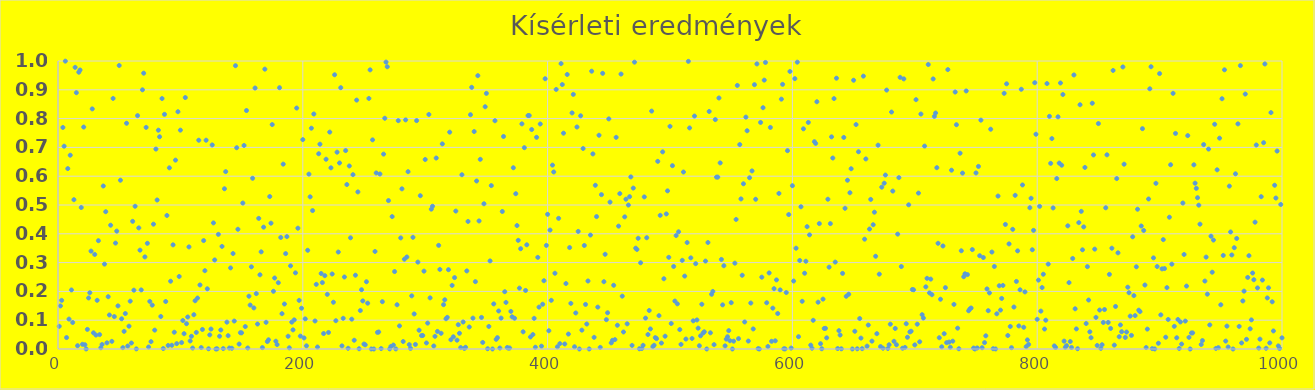
| Category | Series 0 |
|---|---|
| 1.0 | 0.079 |
| 2.0 | 0.15 |
| 3.0 | 0.169 |
| 4.0 | 0.769 |
| 5.0 | 0.704 |
| 6.0 | 0.999 |
| 7.0 | 0.04 |
| 8.0 | 0.626 |
| 9.0 | 0.104 |
| 10.0 | 0.673 |
| 11.0 | 0.205 |
| 12.0 | 0.092 |
| 13.0 | 0.518 |
| 14.0 | 0.978 |
| 15.0 | 0.89 |
| 16.0 | 0.011 |
| 17.0 | 0.961 |
| 18.0 | 0.969 |
| 19.0 | 0.491 |
| 20.0 | 0.016 |
| 21.0 | 0.771 |
| 22.0 | 0.015 |
| 23.0 | 0 |
| 24.0 | 0.068 |
| 25.0 | 0.177 |
| 26.0 | 0.195 |
| 27.0 | 0.34 |
| 28.0 | 0.834 |
| 29.0 | 0.056 |
| 30.0 | 0.328 |
| 31.0 | 0.048 |
| 32.0 | 0.169 |
| 33.0 | 0.376 |
| 34.0 | 0.05 |
| 35.0 | 0.004 |
| 36.0 | 0.016 |
| 37.0 | 0.566 |
| 38.0 | 0.295 |
| 39.0 | 0.477 |
| 40.0 | 0.021 |
| 41.0 | 0.182 |
| 42.0 | 0.118 |
| 43.0 | 0.43 |
| 44.0 | 0.027 |
| 45.0 | 0.87 |
| 46.0 | 0.113 |
| 47.0 | 0.368 |
| 48.0 | 0.409 |
| 49.0 | 0.15 |
| 50.0 | 0.984 |
| 51.0 | 0.586 |
| 52.0 | 0.105 |
| 53.0 | 0.005 |
| 54.0 | 0.061 |
| 55.0 | 0.123 |
| 56.0 | 0.784 |
| 57.0 | 0.01 |
| 58.0 | 0.079 |
| 59.0 | 0.166 |
| 60.0 | 0.021 |
| 61.0 | 0.443 |
| 62.0 | 0.204 |
| 63.0 | 0.496 |
| 64.0 | 0 |
| 65.0 | 0.81 |
| 66.0 | 0.42 |
| 67.0 | 0.343 |
| 68.0 | 0.205 |
| 69.0 | 0.9 |
| 70.0 | 0.958 |
| 71.0 | 0.32 |
| 72.0 | 0.769 |
| 73.0 | 0.367 |
| 74.0 | 0.007 |
| 75.0 | 0.165 |
| 76.0 | 0.025 |
| 77.0 | 0.152 |
| 78.0 | 0.433 |
| 79.0 | 0.066 |
| 80.0 | 0.694 |
| 81.0 | 0.517 |
| 82.0 | 0.76 |
| 83.0 | 0.737 |
| 84.0 | 0.113 |
| 85.0 | 0.87 |
| 86.0 | 0.002 |
| 87.0 | 0.815 |
| 88.0 | 0.165 |
| 89.0 | 0.464 |
| 90.0 | 0.012 |
| 91.0 | 0.629 |
| 92.0 | 0.235 |
| 93.0 | 0.013 |
| 94.0 | 0.362 |
| 95.0 | 0.058 |
| 96.0 | 0.656 |
| 97.0 | 0.019 |
| 98.0 | 0.824 |
| 99.0 | 0.252 |
| 100.0 | 0.76 |
| 101.0 | 0.022 |
| 102.0 | 0.099 |
| 103.0 | 0.053 |
| 104.0 | 0.873 |
| 105.0 | 0.088 |
| 106.0 | 0.111 |
| 107.0 | 0.354 |
| 108.0 | 0.028 |
| 109.0 | 0.044 |
| 110.0 | 0.003 |
| 111.0 | 0.119 |
| 112.0 | 0.168 |
| 113.0 | 0.058 |
| 114.0 | 0.177 |
| 115.0 | 0.725 |
| 116.0 | 0.222 |
| 117.0 | 0.005 |
| 118.0 | 0.068 |
| 119.0 | 0.376 |
| 120.0 | 0.272 |
| 121.0 | 0.725 |
| 122.0 | 0.209 |
| 123.0 | 0.001 |
| 124.0 | 0.049 |
| 125.0 | 0.069 |
| 126.0 | 0.709 |
| 127.0 | 0.438 |
| 128.0 | 0.309 |
| 129.0 | 0 |
| 130.0 | 0.001 |
| 131.0 | 0.398 |
| 132.0 | 0.044 |
| 133.0 | 0.066 |
| 134.0 | 0.356 |
| 135.0 | 0.001 |
| 136.0 | 0.556 |
| 137.0 | 0.616 |
| 138.0 | 0.093 |
| 139.0 | 0.046 |
| 140.0 | 0.003 |
| 141.0 | 0.282 |
| 142.0 | 0.003 |
| 143.0 | 0.331 |
| 144.0 | 0.097 |
| 145.0 | 0.984 |
| 146.0 | 0.699 |
| 147.0 | 0.416 |
| 148.0 | 0.017 |
| 149.0 | 0.056 |
| 150.0 | 0.056 |
| 151.0 | 0.507 |
| 152.0 | 0.707 |
| 153.0 | 0.078 |
| 154.0 | 0.828 |
| 155.0 | 0.004 |
| 156.0 | 0.183 |
| 157.0 | 0.153 |
| 158.0 | 0.285 |
| 159.0 | 0.593 |
| 160.0 | 0.143 |
| 161.0 | 0.906 |
| 162.0 | 0.192 |
| 163.0 | 0.087 |
| 164.0 | 0.454 |
| 165.0 | 0.258 |
| 166.0 | 0.337 |
| 167.0 | 0.005 |
| 168.0 | 0.423 |
| 169.0 | 0.972 |
| 170.0 | 0.093 |
| 171.0 | 0.026 |
| 172.0 | 0.032 |
| 173.0 | 0.529 |
| 174.0 | 0.437 |
| 175.0 | 0.779 |
| 176.0 | 0.2 |
| 177.0 | 0.247 |
| 178.0 | 0.027 |
| 179.0 | 0.015 |
| 180.0 | 0.23 |
| 181.0 | 0.907 |
| 182.0 | 0.387 |
| 183.0 | 0.123 |
| 184.0 | 0.642 |
| 185.0 | 0.156 |
| 186.0 | 0.331 |
| 187.0 | 0.39 |
| 188.0 | 0.044 |
| 189.0 | 0.004 |
| 190.0 | 0.289 |
| 191.0 | 0.093 |
| 192.0 | 0.066 |
| 193.0 | 0.101 |
| 194.0 | 0.264 |
| 195.0 | 0.837 |
| 196.0 | 0.419 |
| 197.0 | 0.169 |
| 198.0 | 0.045 |
| 199.0 | 0.142 |
| 200.0 | 0.727 |
| 201.0 | 0.038 |
| 202.0 | 0.105 |
| 203.0 | 0.011 |
| 204.0 | 0.343 |
| 205.0 | 0.607 |
| 206.0 | 0.528 |
| 207.0 | 0.767 |
| 208.0 | 0.481 |
| 209.0 | 0.816 |
| 210.0 | 0.097 |
| 211.0 | 0.224 |
| 212.0 | 0.007 |
| 213.0 | 0.678 |
| 214.0 | 0.711 |
| 215.0 | 0.262 |
| 216.0 | 0.231 |
| 217.0 | 0.054 |
| 218.0 | 0.255 |
| 219.0 | 0.659 |
| 220.0 | 0.19 |
| 221.0 | 0.057 |
| 222.0 | 0.753 |
| 223.0 | 0.629 |
| 224.0 | 0.26 |
| 225.0 | 0.162 |
| 226.0 | 0.952 |
| 227.0 | 0.098 |
| 228.0 | 0.683 |
| 229.0 | 0.337 |
| 230.0 | 0.646 |
| 231.0 | 0.907 |
| 232.0 | 0.011 |
| 233.0 | 0.107 |
| 234.0 | 0.25 |
| 235.0 | 0.689 |
| 236.0 | 0.571 |
| 237.0 | 0.002 |
| 238.0 | 0.636 |
| 239.0 | 0.386 |
| 240.0 | 0.104 |
| 241.0 | 0.605 |
| 242.0 | 0.03 |
| 243.0 | 0.256 |
| 244.0 | 0.864 |
| 245.0 | 0.545 |
| 246.0 | 0.001 |
| 247.0 | 0.134 |
| 248.0 | 0.206 |
| 249.0 | 0.167 |
| 250.0 | 0.017 |
| 251.0 | 0.015 |
| 252.0 | 0.234 |
| 253.0 | 0.159 |
| 254.0 | 0.87 |
| 255.0 | 0.969 |
| 256.0 | 0 |
| 257.0 | 0.726 |
| 258.0 | 0 |
| 259.0 | 0.339 |
| 260.0 | 0.611 |
| 261.0 | 0.058 |
| 262.0 | 0.059 |
| 263.0 | 0.608 |
| 264.0 | 0.002 |
| 265.0 | 0.164 |
| 266.0 | 0.677 |
| 267.0 | 0.801 |
| 268.0 | 0.996 |
| 269.0 | 0.98 |
| 270.0 | 0.515 |
| 271.0 | 0 |
| 272.0 | 0.009 |
| 273.0 | 0.46 |
| 274.0 | 0.014 |
| 275.0 | 0.269 |
| 276.0 | 0 |
| 277.0 | 0.154 |
| 278.0 | 0.793 |
| 279.0 | 0.08 |
| 280.0 | 0.386 |
| 281.0 | 0.556 |
| 282.0 | 0.026 |
| 283.0 | 0.312 |
| 284.0 | 0.796 |
| 285.0 | 0.319 |
| 286.0 | 0.616 |
| 287.0 | 0.015 |
| 288.0 | 0.002 |
| 289.0 | 0.185 |
| 290.0 | 0.388 |
| 291.0 | 0.122 |
| 292.0 | 0.016 |
| 293.0 | 0.793 |
| 294.0 | 0.302 |
| 295.0 | 0.065 |
| 296.0 | 0.532 |
| 297.0 | 0.047 |
| 298.0 | 0.047 |
| 299.0 | 0.27 |
| 300.0 | 0.658 |
| 301.0 | 0.021 |
| 302.0 | 0.09 |
| 303.0 | 0.814 |
| 304.0 | 0.178 |
| 305.0 | 0.486 |
| 306.0 | 0.496 |
| 307.0 | 0.011 |
| 308.0 | 0.044 |
| 309.0 | 0.663 |
| 310.0 | 0.061 |
| 311.0 | 0.36 |
| 312.0 | 0.276 |
| 313.0 | 0.055 |
| 314.0 | 0.712 |
| 315.0 | 0.154 |
| 316.0 | 0.171 |
| 317.0 | 0.105 |
| 318.0 | 0.11 |
| 319.0 | 0.275 |
| 320.0 | 0.753 |
| 321.0 | 0.032 |
| 322.0 | 0.221 |
| 323.0 | 0.042 |
| 324.0 | 0.248 |
| 325.0 | 0.479 |
| 326.0 | 0.031 |
| 327.0 | 0.084 |
| 328.0 | 0.055 |
| 329.0 | 0.005 |
| 330.0 | 0.605 |
| 331.0 | 0.094 |
| 332.0 | 0.002 |
| 333.0 | 0.006 |
| 334.0 | 0.271 |
| 335.0 | 0.443 |
| 336.0 | 0.076 |
| 337.0 | 0.814 |
| 338.0 | 0.909 |
| 339.0 | 0.107 |
| 340.0 | 0.755 |
| 341.0 | 0.234 |
| 342.0 | 0.583 |
| 343.0 | 0.949 |
| 344.0 | 0.445 |
| 345.0 | 0.659 |
| 346.0 | 0.11 |
| 347.0 | 0.023 |
| 348.0 | 0.504 |
| 349.0 | 0.841 |
| 350.0 | 0.888 |
| 351.0 | 0.001 |
| 352.0 | 0.078 |
| 353.0 | 0.306 |
| 354.0 | 0.567 |
| 355.0 | 0 |
| 356.0 | 0.157 |
| 357.0 | 0.793 |
| 358.0 | 0.034 |
| 359.0 | 0.039 |
| 360.0 | 0.132 |
| 361.0 | 0.003 |
| 362.0 | 0.107 |
| 363.0 | 0.477 |
| 364.0 | 0.738 |
| 365.0 | 0.199 |
| 366.0 | 0.162 |
| 367.0 | 0.005 |
| 368.0 | 0.003 |
| 369.0 | 0.004 |
| 370.0 | 0.131 |
| 371.0 | 0.112 |
| 372.0 | 0.629 |
| 373.0 | 0.107 |
| 374.0 | 0.539 |
| 375.0 | 0.429 |
| 376.0 | 0.377 |
| 377.0 | 0.211 |
| 378.0 | 0.348 |
| 379.0 | 0.782 |
| 380.0 | 0.06 |
| 381.0 | 0.699 |
| 382.0 | 0.203 |
| 383.0 | 0.362 |
| 384.0 | 0.81 |
| 385.0 | 0.811 |
| 386.0 | 0.042 |
| 387.0 | 0.762 |
| 388.0 | 0.05 |
| 389.0 | 0.106 |
| 390.0 | 0.006 |
| 391.0 | 0.735 |
| 392.0 | 0.318 |
| 393.0 | 0.145 |
| 394.0 | 0.781 |
| 395.0 | 0.01 |
| 396.0 | 0.155 |
| 397.0 | 0.237 |
| 398.0 | 0.938 |
| 399.0 | 0.36 |
| 400.0 | 0.468 |
| 401.0 | 0.063 |
| 402.0 | 0.413 |
| 403.0 | 0.169 |
| 404.0 | 0.638 |
| 405.0 | 0.615 |
| 406.0 | 0.263 |
| 407.0 | 0.901 |
| 408.0 | 0.008 |
| 409.0 | 0.454 |
| 410.0 | 0.019 |
| 411.0 | 0.991 |
| 412.0 | 0.918 |
| 413.0 | 0.749 |
| 414.0 | 0.017 |
| 415.0 | 0.227 |
| 416.0 | 0.953 |
| 417.0 | 0.052 |
| 418.0 | 0.352 |
| 419.0 | 0.158 |
| 420.0 | 0.82 |
| 421.0 | 0.884 |
| 422.0 | 0.008 |
| 423.0 | 0.125 |
| 424.0 | 0.771 |
| 425.0 | 0.408 |
| 426.0 | 0 |
| 427.0 | 0.81 |
| 428.0 | 0.065 |
| 429.0 | 0.696 |
| 430.0 | 0.359 |
| 431.0 | 0.155 |
| 432.0 | 0.087 |
| 433.0 | 0.236 |
| 434.0 | 0 |
| 435.0 | 0.396 |
| 436.0 | 0.965 |
| 437.0 | 0.677 |
| 438.0 | 0.04 |
| 439.0 | 0.569 |
| 440.0 | 0.46 |
| 441.0 | 0.145 |
| 442.0 | 0.742 |
| 443.0 | 0.006 |
| 444.0 | 0.536 |
| 445.0 | 0.957 |
| 446.0 | 0.234 |
| 447.0 | 0.329 |
| 448.0 | 0.102 |
| 449.0 | 0.126 |
| 450.0 | 0.799 |
| 451.0 | 0.51 |
| 452.0 | 0.021 |
| 453.0 | 0.03 |
| 454.0 | 0.221 |
| 455.0 | 0.033 |
| 456.0 | 0.735 |
| 457.0 | 0.083 |
| 458.0 | 0.427 |
| 459.0 | 0.539 |
| 460.0 | 0.955 |
| 461.0 | 0.183 |
| 462.0 | 0.059 |
| 463.0 | 0.459 |
| 464.0 | 0.52 |
| 465.0 | 0.087 |
| 466.0 | 0.5 |
| 467.0 | 0.529 |
| 468.0 | 0.598 |
| 469.0 | 0.013 |
| 470.0 | 0.559 |
| 471.0 | 0.996 |
| 472.0 | 0.35 |
| 473.0 | 0.346 |
| 474.0 | 0.384 |
| 475.0 | 0.001 |
| 476.0 | 0.299 |
| 477.0 | 0.002 |
| 478.0 | 0.013 |
| 479.0 | 0.528 |
| 480.0 | 0.107 |
| 481.0 | 0.386 |
| 482.0 | 0.05 |
| 483.0 | 0.134 |
| 484.0 | 0.07 |
| 485.0 | 0.826 |
| 486.0 | 0.008 |
| 487.0 | 0.013 |
| 488.0 | 0.039 |
| 489.0 | 0.036 |
| 490.0 | 0.652 |
| 491.0 | 0.116 |
| 492.0 | 0.464 |
| 493.0 | 0.021 |
| 494.0 | 0.684 |
| 495.0 | 0.244 |
| 496.0 | 0.044 |
| 497.0 | 0.469 |
| 498.0 | 0.549 |
| 499.0 | 0.318 |
| 500.0 | 0.773 |
| 501.0 | 0.089 |
| 502.0 | 0.636 |
| 503.0 | 0.287 |
| 504.0 | 0.166 |
| 505.0 | 0.394 |
| 506.0 | 0.157 |
| 507.0 | 0.407 |
| 508.0 | 0.067 |
| 509.0 | 0.016 |
| 510.0 | 0.308 |
| 511.0 | 0.615 |
| 512.0 | 0.253 |
| 513.0 | 0.035 |
| 514.0 | 0.37 |
| 515.0 | 0.999 |
| 516.0 | 0.768 |
| 517.0 | 0.316 |
| 518.0 | 0.037 |
| 519.0 | 0.098 |
| 520.0 | 0.809 |
| 521.0 | 0.296 |
| 522.0 | 0.101 |
| 523.0 | 0.072 |
| 524.0 | 0.011 |
| 525.0 | 0.046 |
| 526.0 | 0.155 |
| 527.0 | 0.055 |
| 528.0 | 0.06 |
| 529.0 | 0.305 |
| 530.0 | 0 |
| 531.0 | 0.37 |
| 532.0 | 0.825 |
| 533.0 | 0.056 |
| 534.0 | 0.19 |
| 535.0 | 0.2 |
| 536.0 | 0.015 |
| 537.0 | 0.797 |
| 538.0 | 0.597 |
| 539.0 | 0.597 |
| 540.0 | 0.872 |
| 541.0 | 0.646 |
| 542.0 | 0.311 |
| 543.0 | 0.153 |
| 544.0 | 0.289 |
| 545.0 | 0.011 |
| 546.0 | 0.034 |
| 547.0 | 0.043 |
| 548.0 | 0.064 |
| 549.0 | 0.029 |
| 550.0 | 0.161 |
| 551.0 | 0 |
| 552.0 | 0.027 |
| 553.0 | 0.298 |
| 554.0 | 0.45 |
| 555.0 | 0.915 |
| 556.0 | 0.036 |
| 557.0 | 0.71 |
| 558.0 | 0.521 |
| 559.0 | 0.256 |
| 560.0 | 0.574 |
| 561.0 | 0.094 |
| 562.0 | 0.805 |
| 563.0 | 0.758 |
| 564.0 | 0.028 |
| 565.0 | 0.595 |
| 566.0 | 0.16 |
| 567.0 | 0.618 |
| 568.0 | 0.07 |
| 569.0 | 0.918 |
| 570.0 | 0.52 |
| 571.0 | 0.99 |
| 572.0 | 0.001 |
| 573.0 | 0 |
| 574.0 | 0.787 |
| 575.0 | 0.249 |
| 576.0 | 0.838 |
| 577.0 | 0.934 |
| 578.0 | 0.995 |
| 579.0 | 0.161 |
| 580.0 | 0.009 |
| 581.0 | 0.264 |
| 582.0 | 0.769 |
| 583.0 | 0.027 |
| 584.0 | 0.142 |
| 585.0 | 0.209 |
| 586.0 | 0.028 |
| 587.0 | 0.24 |
| 588.0 | 0.123 |
| 589.0 | 0.54 |
| 590.0 | 0.205 |
| 591.0 | 0.868 |
| 592.0 | 0.919 |
| 593.0 | 0.001 |
| 594.0 | 0 |
| 595.0 | 0.196 |
| 596.0 | 0.689 |
| 597.0 | 0.467 |
| 598.0 | 0.964 |
| 599.0 | 0.003 |
| 600.0 | 0.567 |
| 601.0 | 0.236 |
| 602.0 | 0.939 |
| 603.0 | 0.35 |
| 604.0 | 0.996 |
| 605.0 | 0.043 |
| 606.0 | 0.307 |
| 607.0 | 0.494 |
| 608.0 | 0.166 |
| 609.0 | 0.764 |
| 610.0 | 0.263 |
| 611.0 | 0.305 |
| 612.0 | 0.425 |
| 613.0 | 0.787 |
| 614.0 | 0.396 |
| 615.0 | 0.013 |
| 616.0 | 0.003 |
| 617.0 | 0.1 |
| 618.0 | 0.72 |
| 619.0 | 0.714 |
| 620.0 | 0.859 |
| 621.0 | 0.163 |
| 622.0 | 0.435 |
| 623.0 | 0.018 |
| 624.0 | 0.001 |
| 625.0 | 0.173 |
| 626.0 | 0.071 |
| 627.0 | 0.072 |
| 628.0 | 0.039 |
| 629.0 | 0.52 |
| 630.0 | 0.284 |
| 631.0 | 0.435 |
| 632.0 | 0.737 |
| 633.0 | 0.663 |
| 634.0 | 0.869 |
| 635.0 | 0.302 |
| 636.0 | 0.94 |
| 637.0 | 0.002 |
| 638.0 | 0.064 |
| 639.0 | 0.048 |
| 640.0 | 0.001 |
| 641.0 | 0.263 |
| 642.0 | 0.735 |
| 643.0 | 0.488 |
| 644.0 | 0.183 |
| 645.0 | 0.586 |
| 646.0 | 0.19 |
| 647.0 | 0.543 |
| 648.0 | 0.626 |
| 649.0 | 0 |
| 650.0 | 0.933 |
| 651.0 | 0.062 |
| 652.0 | 0.779 |
| 653.0 | 0.001 |
| 654.0 | 0.685 |
| 655.0 | 0.106 |
| 656.0 | 0.038 |
| 657.0 | 0.001 |
| 658.0 | 0.947 |
| 659.0 | 0.381 |
| 660.0 | 0.66 |
| 661.0 | 0.01 |
| 662.0 | 0.083 |
| 663.0 | 0.417 |
| 664.0 | 0.519 |
| 665.0 | 0.027 |
| 666.0 | 0.432 |
| 667.0 | 0.475 |
| 668.0 | 0.322 |
| 669.0 | 0.053 |
| 670.0 | 0.708 |
| 671.0 | 0.26 |
| 672.0 | 0.008 |
| 673.0 | 0.562 |
| 674.0 | 0.003 |
| 675.0 | 0.576 |
| 676.0 | 0.604 |
| 677.0 | 0.899 |
| 678.0 | 0.002 |
| 679.0 | 0.015 |
| 680.0 | 0.086 |
| 681.0 | 0.823 |
| 682.0 | 0.548 |
| 683.0 | 0.027 |
| 684.0 | 0.071 |
| 685.0 | 0.015 |
| 686.0 | 0.399 |
| 687.0 | 0.595 |
| 688.0 | 0.943 |
| 689.0 | 0.286 |
| 690.0 | 0.003 |
| 691.0 | 0.938 |
| 692.0 | 0.005 |
| 693.0 | 0.088 |
| 694.0 | 0.041 |
| 695.0 | 0.501 |
| 696.0 | 0.059 |
| 697.0 | 0.062 |
| 698.0 | 0.207 |
| 699.0 | 0.205 |
| 700.0 | 0.014 |
| 701.0 | 0.866 |
| 702.0 | 0.086 |
| 703.0 | 0.541 |
| 704.0 | 0.025 |
| 705.0 | 0.816 |
| 706.0 | 0.119 |
| 707.0 | 0.108 |
| 708.0 | 0.705 |
| 709.0 | 0.216 |
| 710.0 | 0.245 |
| 711.0 | 0.988 |
| 712.0 | 0.195 |
| 713.0 | 0.243 |
| 714.0 | 0.189 |
| 715.0 | 0.938 |
| 716.0 | 0.808 |
| 717.0 | 0.819 |
| 718.0 | 0.63 |
| 719.0 | 0.367 |
| 720.0 | 0.039 |
| 721.0 | 0.173 |
| 722.0 | 0.008 |
| 723.0 | 0.358 |
| 724.0 | 0.053 |
| 725.0 | 0.213 |
| 726.0 | 0.022 |
| 727.0 | 0.97 |
| 728.0 | 0.024 |
| 729.0 | 0.006 |
| 730.0 | 0.621 |
| 731.0 | 0.027 |
| 732.0 | 0.155 |
| 733.0 | 0.892 |
| 734.0 | 0.779 |
| 735.0 | 0.072 |
| 736.0 | 0.001 |
| 737.0 | 0.68 |
| 738.0 | 0.341 |
| 739.0 | 0.611 |
| 740.0 | 0.251 |
| 741.0 | 0.261 |
| 742.0 | 0.896 |
| 743.0 | 0.258 |
| 744.0 | 0.133 |
| 745.0 | 0.139 |
| 746.0 | 0.142 |
| 747.0 | 0.345 |
| 748.0 | 0.003 |
| 749.0 | 0 |
| 750.0 | 0.611 |
| 751.0 | 0.004 |
| 752.0 | 0.634 |
| 753.0 | 0.324 |
| 754.0 | 0.795 |
| 755.0 | 0.004 |
| 756.0 | 0.318 |
| 757.0 | 0.022 |
| 758.0 | 0.046 |
| 759.0 | 0.209 |
| 760.0 | 0.133 |
| 761.0 | 0.195 |
| 762.0 | 0.763 |
| 763.0 | 0.337 |
| 764.0 | 0.001 |
| 765.0 | 0.287 |
| 766.0 | 0 |
| 767.0 | 0.122 |
| 768.0 | 0.531 |
| 769.0 | 0.22 |
| 770.0 | 0.135 |
| 771.0 | 0.176 |
| 772.0 | 0.221 |
| 773.0 | 0.888 |
| 774.0 | 0.432 |
| 775.0 | 0.921 |
| 776.0 | 0.047 |
| 777.0 | 0.365 |
| 778.0 | 0.078 |
| 779.0 | 0.005 |
| 780.0 | 0.416 |
| 781.0 | 0.146 |
| 782.0 | 0.534 |
| 783.0 | 0.235 |
| 784.0 | 0.341 |
| 785.0 | 0.08 |
| 786.0 | 0.206 |
| 787.0 | 0.902 |
| 788.0 | 0.57 |
| 789.0 | 0.075 |
| 790.0 | 0.198 |
| 791.0 | 0.008 |
| 792.0 | 0.032 |
| 793.0 | 0.016 |
| 794.0 | 0.49 |
| 795.0 | 0.523 |
| 796.0 | 0.345 |
| 797.0 | 0.412 |
| 798.0 | 0.925 |
| 799.0 | 0.746 |
| 800.0 | 0.103 |
| 801.0 | 0.239 |
| 802.0 | 0.495 |
| 803.0 | 0.132 |
| 804.0 | 0.213 |
| 805.0 | 0.26 |
| 806.0 | 0.069 |
| 807.0 | 0.1 |
| 808.0 | 0.922 |
| 809.0 | 0.295 |
| 810.0 | 0.808 |
| 811.0 | 0.645 |
| 812.0 | 0.731 |
| 813.0 | 0.49 |
| 814.0 | 0.011 |
| 815.0 | 0.006 |
| 816.0 | 0.592 |
| 817.0 | 0.806 |
| 818.0 | 0.646 |
| 819.0 | 0.924 |
| 820.0 | 0.638 |
| 821.0 | 0.884 |
| 822.0 | 0.027 |
| 823.0 | 0.006 |
| 824.0 | 0.012 |
| 825.0 | 0.428 |
| 826.0 | 0.231 |
| 827.0 | 0.026 |
| 828.0 | 0.005 |
| 829.0 | 0.314 |
| 830.0 | 0.952 |
| 831.0 | 0.14 |
| 832.0 | 0.07 |
| 833.0 | 0.001 |
| 834.0 | 0.439 |
| 835.0 | 0.848 |
| 836.0 | 0.478 |
| 837.0 | 0.344 |
| 838.0 | 0.424 |
| 839.0 | 0.63 |
| 840.0 | 0.088 |
| 841.0 | 0.286 |
| 842.0 | 0.17 |
| 843.0 | 0.06 |
| 844.0 | 0.039 |
| 845.0 | 0.853 |
| 846.0 | 0.674 |
| 847.0 | 0.347 |
| 848.0 | 0.11 |
| 849.0 | 0.012 |
| 850.0 | 0.783 |
| 851.0 | 0.135 |
| 852.0 | 0.002 |
| 853.0 | 0.015 |
| 854.0 | 0.092 |
| 855.0 | 0.137 |
| 856.0 | 0.49 |
| 857.0 | 0.674 |
| 858.0 | 0.092 |
| 859.0 | 0.259 |
| 860.0 | 0.071 |
| 861.0 | 0.35 |
| 862.0 | 0.967 |
| 863.0 | 0.013 |
| 864.0 | 0.148 |
| 865.0 | 0.592 |
| 866.0 | 0.334 |
| 867.0 | 0.043 |
| 868.0 | 0.084 |
| 869.0 | 0.06 |
| 870.0 | 0.979 |
| 871.0 | 0.642 |
| 872.0 | 0.04 |
| 873.0 | 0.059 |
| 874.0 | 0.215 |
| 875.0 | 0.195 |
| 876.0 | 0.114 |
| 877.0 | 0.047 |
| 878.0 | 0.39 |
| 879.0 | 0.185 |
| 880.0 | 0.116 |
| 881.0 | 0.285 |
| 882.0 | 0.485 |
| 883.0 | 0.135 |
| 884.0 | 0.13 |
| 885.0 | 0.427 |
| 886.0 | 0.765 |
| 887.0 | 0.412 |
| 888.0 | 0.222 |
| 889.0 | 0.005 |
| 890.0 | 0.069 |
| 891.0 | 0.521 |
| 892.0 | 0.903 |
| 893.0 | 0.98 |
| 894.0 | 0.001 |
| 895.0 | 0.316 |
| 896.0 | 0 |
| 897.0 | 0.575 |
| 898.0 | 0.286 |
| 899.0 | 0.02 |
| 900.0 | 0.956 |
| 901.0 | 0.119 |
| 902.0 | 0.278 |
| 903.0 | 0.38 |
| 904.0 | 0.279 |
| 905.0 | 0.041 |
| 906.0 | 0.213 |
| 907.0 | 0.103 |
| 908.0 | 0.458 |
| 909.0 | 0.64 |
| 910.0 | 0.295 |
| 911.0 | 0.888 |
| 912.0 | 0.079 |
| 913.0 | 0.749 |
| 914.0 | 0.039 |
| 915.0 | 0.103 |
| 916.0 | 0.002 |
| 917.0 | 0.094 |
| 918.0 | 0.017 |
| 919.0 | 0.507 |
| 920.0 | 0.328 |
| 921.0 | 0.097 |
| 922.0 | 0.218 |
| 923.0 | 0.741 |
| 924.0 | 0.04 |
| 925.0 | 0 |
| 926.0 | 0.056 |
| 927.0 | 0.056 |
| 928.0 | 0.64 |
| 929.0 | 0.576 |
| 930.0 | 0.558 |
| 931.0 | 0.525 |
| 932.0 | 0.499 |
| 933.0 | 0.433 |
| 934.0 | 0.016 |
| 935.0 | 0.029 |
| 936.0 | 0.71 |
| 937.0 | 0.236 |
| 938.0 | 0.319 |
| 939.0 | 0.19 |
| 940.0 | 0.694 |
| 941.0 | 0.084 |
| 942.0 | 0.392 |
| 943.0 | 0.267 |
| 944.0 | 0.378 |
| 945.0 | 0.78 |
| 946.0 | 0.002 |
| 947.0 | 0.622 |
| 948.0 | 0.005 |
| 949.0 | 0.732 |
| 950.0 | 0.154 |
| 951.0 | 0.869 |
| 952.0 | 0.325 |
| 953.0 | 0.969 |
| 954.0 | 0.028 |
| 955.0 | 0.079 |
| 956.0 | 0.007 |
| 957.0 | 0.566 |
| 958.0 | 0.406 |
| 959.0 | 0.327 |
| 960.0 | 0 |
| 961.0 | 0.352 |
| 962.0 | 0.608 |
| 963.0 | 0.384 |
| 964.0 | 0.782 |
| 965.0 | 0.078 |
| 966.0 | 0.984 |
| 967.0 | 0.021 |
| 968.0 | 0.167 |
| 969.0 | 0.201 |
| 970.0 | 0.885 |
| 971.0 | 0.034 |
| 972.0 | 0.248 |
| 973.0 | 0.324 |
| 974.0 | 0.07 |
| 975.0 | 0.101 |
| 976.0 | 0.264 |
| 977.0 | 0.24 |
| 978.0 | 0.44 |
| 979.0 | 0.708 |
| 980.0 | 0.212 |
| 981.0 | 0.003 |
| 982.0 | 0.034 |
| 983.0 | 0.529 |
| 984.0 | 0.239 |
| 985.0 | 0.716 |
| 986.0 | 0.99 |
| 987.0 | 0.002 |
| 988.0 | 0.177 |
| 989.0 | 0.212 |
| 990.0 | 0.021 |
| 991.0 | 0.821 |
| 992.0 | 0.164 |
| 993.0 | 0.063 |
| 994.0 | 0.569 |
| 995.0 | 0.524 |
| 996.0 | 0.687 |
| 997.0 | 0.011 |
| 998.0 | 0.002 |
| 999.0 | 0.502 |
| 1000.0 | 0.039 |